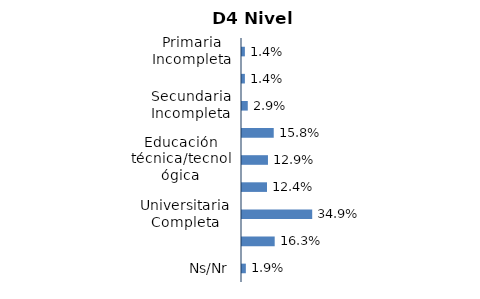
| Category | Series 0 |
|---|---|
| Primaria Incompleta | 0.014 |
| Primaria Completa | 0.014 |
| Secundaria Incompleta | 0.029 |
| Secundaria Completa | 0.158 |
| Educación técnica/tecnológica | 0.129 |
| Universitaria Incompleta | 0.124 |
| Universitaria Completa | 0.349 |
| Postgrado | 0.163 |
| Ns/Nr | 0.019 |